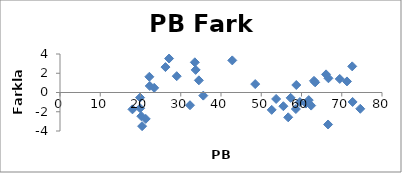
| Category | Series 0 |
|---|---|
| 20.4 | -3.498 |
| 20.2 | -2.462 |
| 21.3 | -2.74 |
| 19.9 | -1.636 |
| 18.0 | -1.749 |
| 19.9 | -0.531 |
| 22.2 | 1.634 |
| 22.3 | 0.678 |
| 23.4 | 0.483 |
| 26.2 | 2.641 |
| 27.1 | 3.53 |
| 29.0 | 1.696 |
| 33.5 | 3.135 |
| 42.8 | 3.336 |
| 35.6 | -0.324 |
| 32.3 | -1.323 |
| 33.7 | 2.349 |
| 34.5 | 1.264 |
| 48.5 | 0.875 |
| 66.1 | 1.884 |
| 62.4 | -1.359 |
| 58.6 | -1.717 |
| 56.7 | -2.576 |
| 55.5 | -1.425 |
| 57.3 | -0.557 |
| 53.7 | -0.671 |
| 52.6 | -1.804 |
| 61.1 | -1.148 |
| 66.6 | -3.324 |
| 69.5 | 1.409 |
| 74.6 | -1.692 |
| 72.7 | -0.983 |
| 71.3 | 1.15 |
| 72.6 | 2.715 |
| 66.7 | 1.478 |
| 61.8 | -0.789 |
| 58.7 | 0.778 |
| 63.1 | 1.212 |
| 59.6 | -0.992 |
| 63.4 | 1.054 |